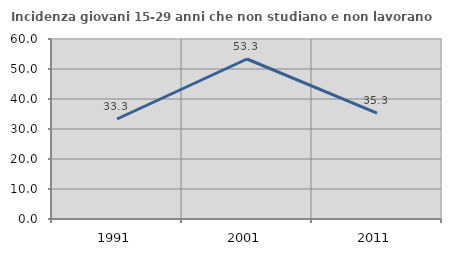
| Category | Incidenza giovani 15-29 anni che non studiano e non lavorano  |
|---|---|
| 1991.0 | 33.333 |
| 2001.0 | 53.333 |
| 2011.0 | 35.294 |